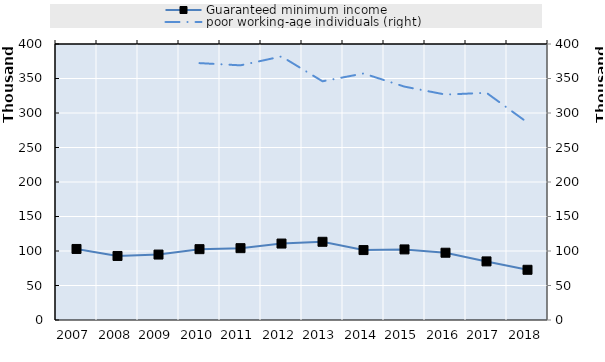
| Category | Guaranteed minimum income  |
|---|---|
| 2007.0 | 102953 |
| 2008.0 | 92819 |
| 2009.0 | 94849 |
| 2010.0 | 102668 |
| 2011.0 | 104112 |
| 2012.0 | 110794 |
| 2013.0 | 113358 |
| 2014.0 | 101343 |
| 2015.0 | 102297 |
| 2016.0 | 97492 |
| 2017.0 | 84930 |
| 2018.0 | 72759 |